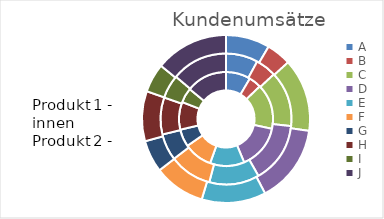
| Category | Produkt 1 | Produkt 2 | Produkt 3 |
|---|---|---|---|
| A | 23876 | 22142 | 24136 |
| B | 12056 | 14356 | 13568 |
| C | 43776 | 38245 | 40002 |
| D | 43120 | 41988 | 42874 |
| E | 33219 | 34563 | 35245 |
| F | 27654 | 29345 | 28167 |
| G | 16901 | 18385 | 17598 |
| H | 26754 | 25512 | 27456 |
| I | 14321 | 16342 | 15839 |
| J | 39453 | 38654 | 40122 |